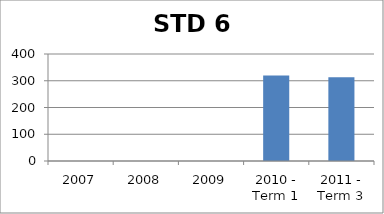
| Category | Score |
|---|---|
| 2007 | 0 |
| 2008 | 0 |
| 2009 | 0 |
| 2010 - Term 1 | 319.93 |
| 2011 - Term 3 | 312.81 |